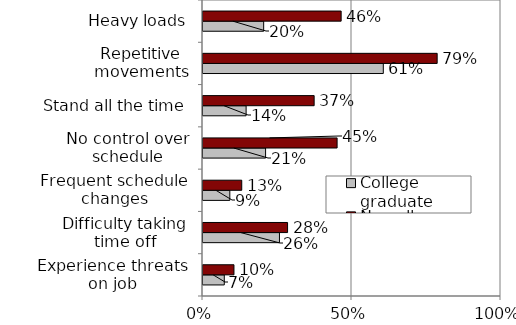
| Category | College graduate | No college degree |
|---|---|---|
| Experience threats on job | 7.142 | 10.39 |
| Difficulty taking time off | 25.656 | 28.379 |
| Frequent schedule changes | 9 | 13 |
| No control over schedule | 21 | 45 |
| Stand all the time | 14.469 | 37.299 |
| Repetitive movements | 60.507 | 78.579 |
| Heavy loads | 20.362 | 46.357 |